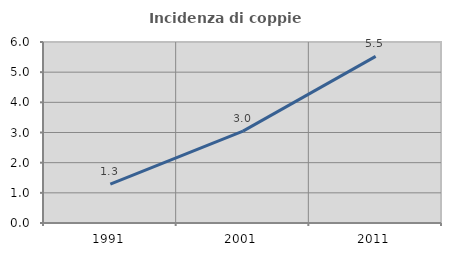
| Category | Incidenza di coppie miste |
|---|---|
| 1991.0 | 1.288 |
| 2001.0 | 3.045 |
| 2011.0 | 5.522 |